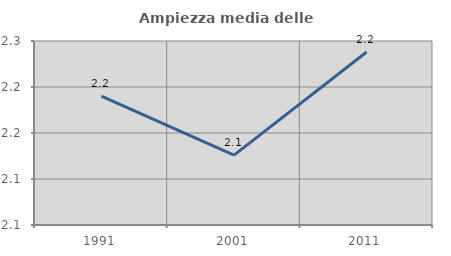
| Category | Ampiezza media delle famiglie |
|---|---|
| 1991.0 | 2.19 |
| 2001.0 | 2.126 |
| 2011.0 | 2.238 |